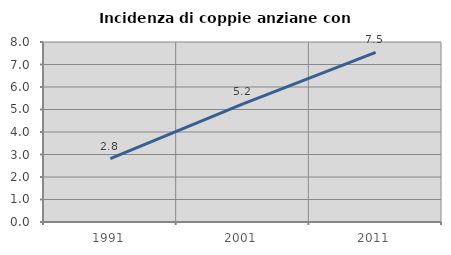
| Category | Incidenza di coppie anziane con figli |
|---|---|
| 1991.0 | 2.821 |
| 2001.0 | 5.246 |
| 2011.0 | 7.541 |